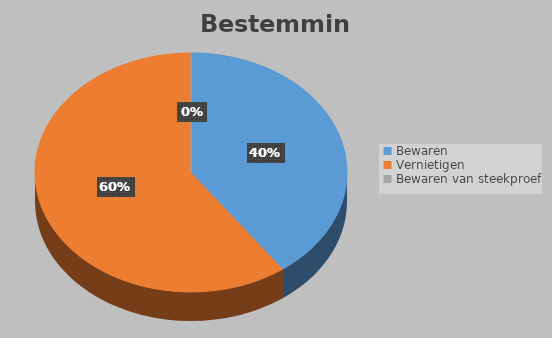
| Category | Series 0 |
|---|---|
| Bewaren | 0.4 |
| Vernietigen | 0.6 |
| Bewaren van steekproef | 0 |